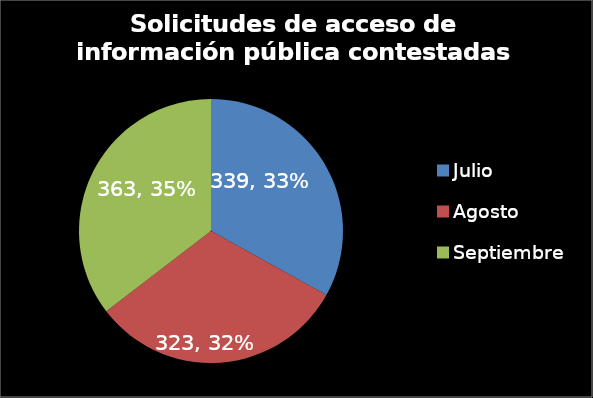
| Category | Series 0 |
|---|---|
| Julio | 339 |
| Agosto | 323 |
| Septiembre | 363 |